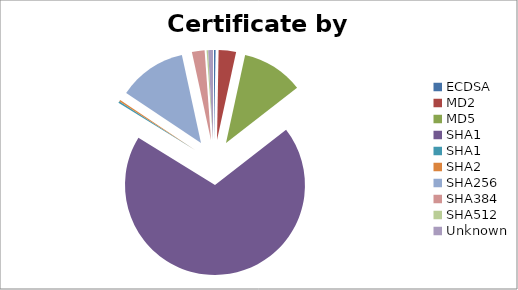
| Category | Count |
|---|---|
| ECDSA | 1 |
| MD2 | 11 |
| MD5 | 39 |
| SHA1 | 244 |
| SHA1  | 1 |
| SHA2 | 1 |
| SHA256 | 43 |
| SHA384 | 8 |
| SHA512 | 1 |
| Unknown | 3 |